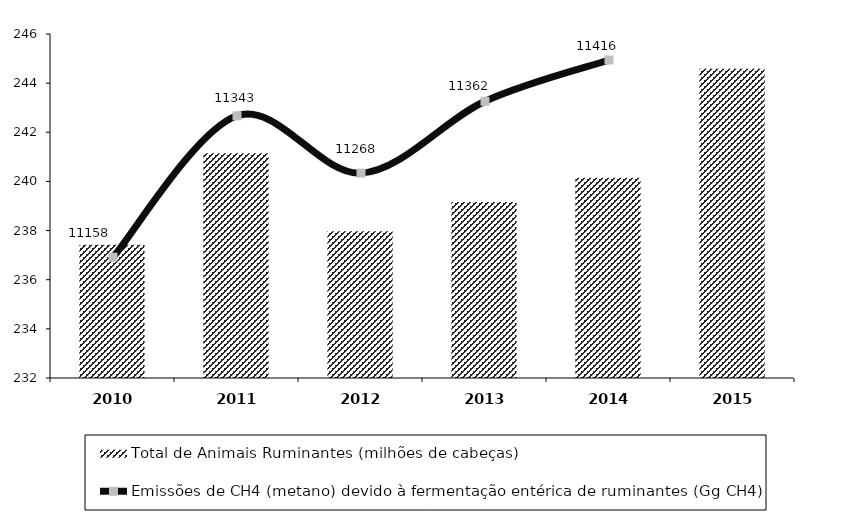
| Category | Total de Animais Ruminantes (milhões de cabeças) |
|---|---|
| 2010 | 237.419 |
| 2011 | 241.148 |
| 2012 | 237.977 |
| 2013 | 239.166 |
| 2014 | 240.152 |
| 2015 | 244.59 |